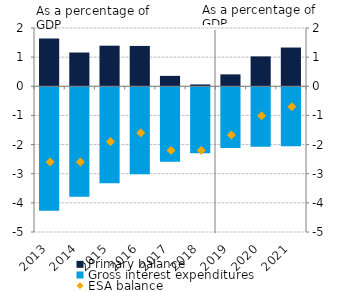
| Category | Primary balance | Gross interest expenditures |
|---|---|---|
| 2013.0 | 1.641 | -4.241 |
| 2014.0 | 1.159 | -3.759 |
| 2015.0 | 1.393 | -3.293 |
| 2016.0 | 1.385 | -2.985 |
| 2017.0 | 0.358 | -2.558 |
| 2018.0 | 0.064 | -2.264 |
| 2019.0 | 0.409 | -2.082 |
| 2020.0 | 1.026 | -2.038 |
| 2021.0 | 1.33 | -2.027 |